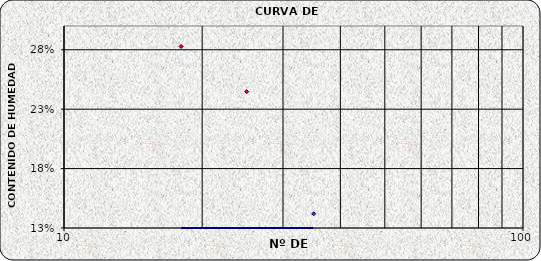
| Category | Series 0 |
|---|---|
| 35.0 | 0.142 |
| 25.0 | 0.245 |
| 18.0 | 0.283 |